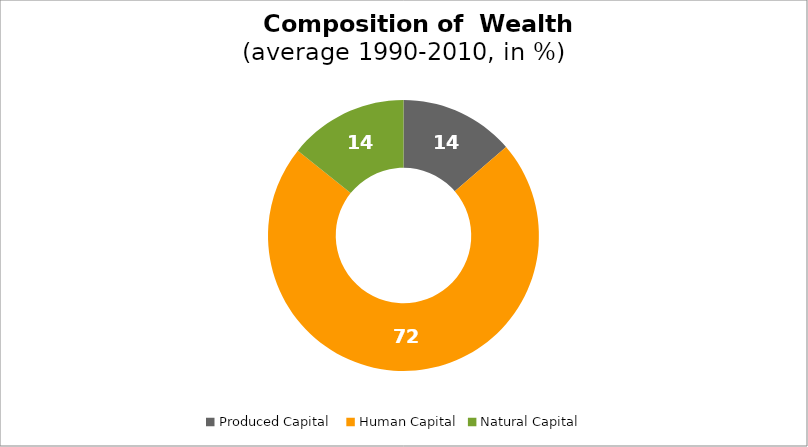
| Category | Series 0 |
|---|---|
| Produced Capital  | 13.665 |
| Human Capital | 72.105 |
| Natural Capital | 14.23 |